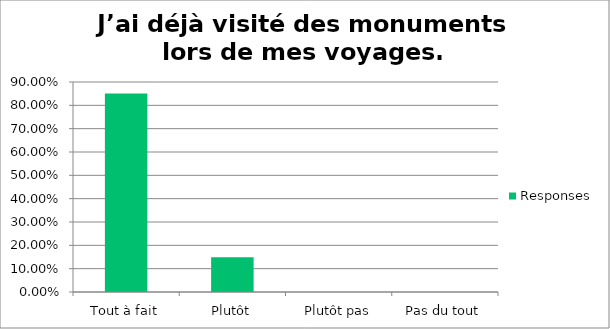
| Category | Responses |
|---|---|
| Tout à fait | 0.851 |
| Plutôt | 0.149 |
| Plutôt pas | 0 |
| Pas du tout | 0 |